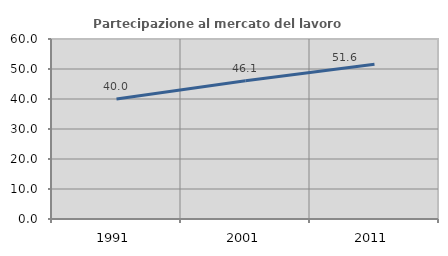
| Category | Partecipazione al mercato del lavoro  femminile |
|---|---|
| 1991.0 | 40 |
| 2001.0 | 46.058 |
| 2011.0 | 51.613 |